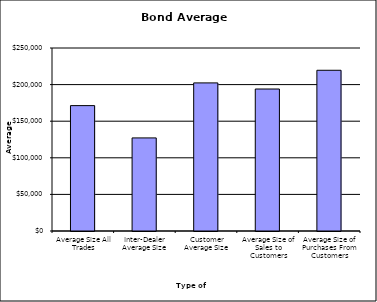
| Category | Security Type |
|---|---|
| Average Size All Trades | 171297.818 |
| Inter-Dealer Average Size | 127174.181 |
| Customer Average Size | 202319.796 |
| Average Size of Sales to Customers | 193986.742 |
| Average Size of Purchases From Customers | 219570.461 |